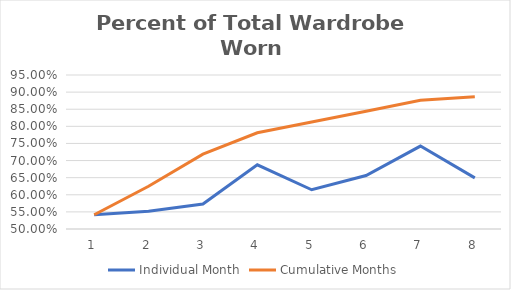
| Category | Individual Month | Cumulative Months |
|---|---|---|
| 0 | 0.542 | 0.542 |
| 1 | 0.552 | 0.625 |
| 2 | 0.573 | 0.719 |
| 3 | 0.688 | 0.781 |
| 4 | 0.615 | 0.812 |
| 5 | 0.656 | 0.844 |
| 6 | 0.742 | 0.876 |
| 7 | 0.65 | 0.887 |